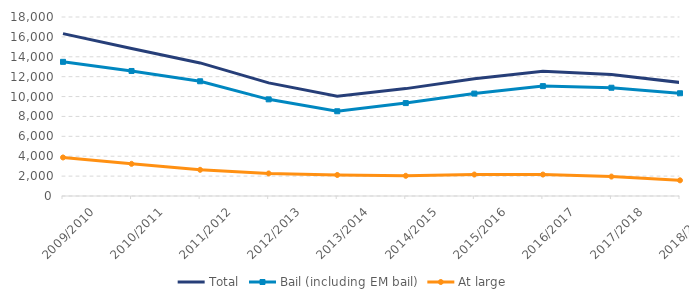
| Category | Total | Bail (including EM bail) | At large |
|---|---|---|---|
| 2009/2010 | 16325 | 13492 | 3875 |
| 2010/2011 | 14839 | 12572 | 3233 |
| 2011/2012 | 13383 | 11536 | 2633 |
| 2012/2013 | 11372 | 9719 | 2266 |
| 2013/2014 | 10041 | 8521 | 2115 |
| 2014/2015 | 10799 | 9343 | 2031 |
| 2015/2016 | 11797 | 10298 | 2159 |
| 2016/2017 | 12550 | 11049 | 2156 |
| 2017/2018 | 12227 | 10886 | 1953 |
| 2018/2019 | 11414 | 10332 | 1576 |